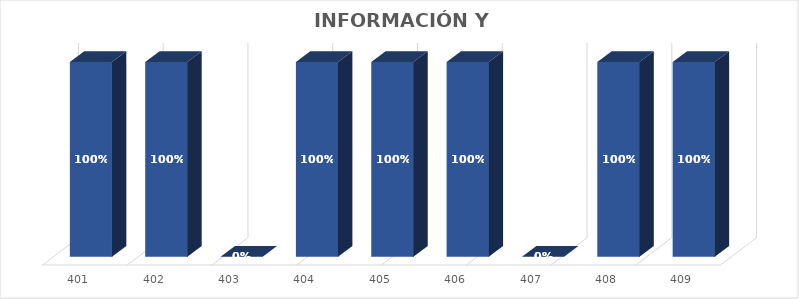
| Category | % Avance |
|---|---|
| 401.0 | 1 |
| 402.0 | 1 |
| 403.0 | 0 |
| 404.0 | 1 |
| 405.0 | 1 |
| 406.0 | 1 |
| 407.0 | 0 |
| 408.0 | 1 |
| 409.0 | 1 |